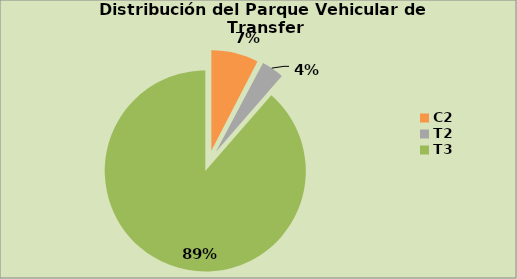
| Category | Series 0 |
|---|---|
| C2 | 7.58 |
| C3  | 0.187 |
| T2 | 3.623 |
| T3 | 88.61 |